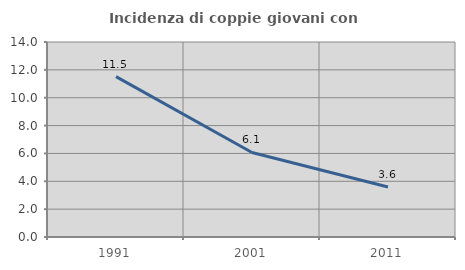
| Category | Incidenza di coppie giovani con figli |
|---|---|
| 1991.0 | 11.511 |
| 2001.0 | 6.067 |
| 2011.0 | 3.586 |